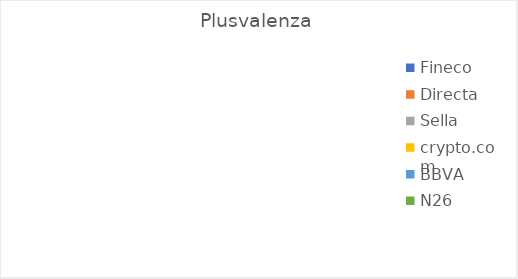
| Category | Plusvalenza |
|---|---|
| Fineco | 0 |
| Directa | 0 |
| Sella | 0 |
| crypto.com | 0 |
| BBVA | 0 |
| N26 | 0 |